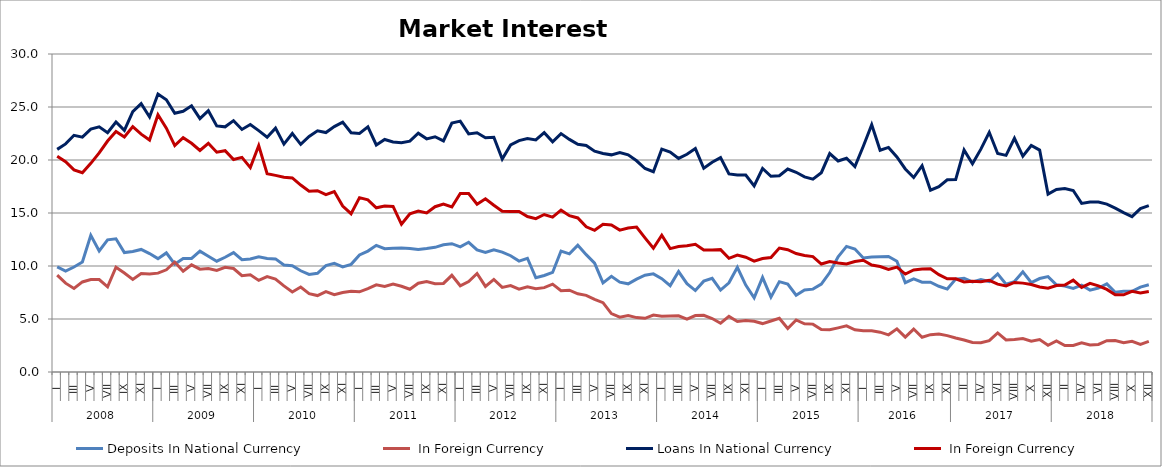
| Category | Deposits | Loans |
|---|---|---|
| 0 | 9.137 | 20.354 |
| 1 | 8.38 | 19.831 |
| 2 | 7.883 | 19.065 |
| 3 | 8.496 | 18.793 |
| 4 | 8.724 | 19.686 |
| 5 | 8.718 | 20.674 |
| 6 | 8.041 | 21.792 |
| 7 | 9.883 | 22.683 |
| 8 | 9.345 | 22.171 |
| 9 | 8.74 | 23.151 |
| 10 | 9.296 | 22.44 |
| 11 | 9.249 | 21.881 |
| 12 | 9.327 | 24.264 |
| 13 | 9.643 | 23.008 |
| 14 | 10.375 | 21.357 |
| 15 | 9.5 | 22.1 |
| 16 | 10.112 | 21.579 |
| 17 | 9.7 | 20.9 |
| 18 | 9.755 | 21.577 |
| 19 | 9.586 | 20.738 |
| 20 | 9.871 | 20.882 |
| 21 | 9.763 | 20.05 |
| 22 | 9.091 | 20.248 |
| 23 | 9.175 | 19.284 |
| 24 | 8.643 | 21.363 |
| 25 | 8.997 | 18.71 |
| 26 | 8.763 | 18.548 |
| 27 | 8.129 | 18.381 |
| 28 | 7.542 | 18.308 |
| 29 | 8.016 | 17.639 |
| 30 | 7.391 | 17.062 |
| 31 | 7.21 | 17.1 |
| 32 | 7.587 | 16.729 |
| 33 | 7.286 | 17.025 |
| 34 | 7.492 | 15.659 |
| 35 | 7.61 | 14.933 |
| 36 | 7.567 | 16.448 |
| 37 | 7.87 | 16.245 |
| 38 | 8.222 | 15.495 |
| 39 | 8.08 | 15.667 |
| 40 | 8.291 | 15.619 |
| 41 | 8.087 | 13.934 |
| 42 | 7.811 | 14.92 |
| 43 | 8.37 | 15.184 |
| 44 | 8.526 | 15.009 |
| 45 | 8.33 | 15.595 |
| 46 | 8.356 | 15.834 |
| 47 | 9.122 | 15.574 |
| 48 | 8.134 | 16.848 |
| 49 | 8.538 | 16.83 |
| 50 | 9.292 | 15.829 |
| 51 | 8.074 | 16.345 |
| 52 | 8.733 | 15.733 |
| 53 | 7.982 | 15.168 |
| 54 | 8.15 | 15.137 |
| 55 | 7.811 | 15.15 |
| 56 | 8.033 | 14.665 |
| 57 | 7.859 | 14.472 |
| 58 | 7.958 | 14.858 |
| 59 | 8.289 | 14.612 |
| 60 | 7.668 | 15.267 |
| 61 | 7.721 | 14.749 |
| 62 | 7.38 | 14.533 |
| 63 | 7.234 | 13.698 |
| 64 | 6.856 | 13.365 |
| 65 | 6.545 | 13.936 |
| 66 | 5.508 | 13.862 |
| 67 | 5.179 | 13.383 |
| 68 | 5.319 | 13.588 |
| 69 | 5.132 | 13.67 |
| 70 | 5.067 | 12.658 |
| 71 | 5.368 | 11.674 |
| 72 | 5.25 | 12.906 |
| 73 | 5.279 | 11.641 |
| 74 | 5.297 | 11.841 |
| 75 | 4.985 | 11.909 |
| 76 | 5.325 | 12.051 |
| 77 | 5.352 | 11.504 |
| 78 | 5.047 | 11.499 |
| 79 | 4.596 | 11.543 |
| 80 | 5.244 | 10.726 |
| 81 | 4.762 | 11.036 |
| 82 | 4.869 | 10.828 |
| 83 | 4.779 | 10.462 |
| 84 | 4.569 | 10.7 |
| 85 | 4.811 | 10.805 |
| 86 | 5.066 | 11.691 |
| 87 | 4.1 | 11.535 |
| 88 | 4.907 | 11.178 |
| 89 | 4.545 | 11 |
| 90 | 4.517 | 10.889 |
| 91 | 4 | 10.188 |
| 92 | 3.981 | 10.416 |
| 93 | 4.164 | 10.276 |
| 94 | 4.358 | 10.188 |
| 95 | 3.977 | 10.418 |
| 96 | 3.892 | 10.543 |
| 97 | 3.89 | 10.092 |
| 98 | 3.757 | 9.946 |
| 99 | 3.505 | 9.677 |
| 100 | 4.071 | 9.899 |
| 101 | 3.296 | 9.237 |
| 102 | 4.052 | 9.631 |
| 103 | 3.28 | 9.709 |
| 104 | 3.523 | 9.747 |
| 105 | 3.578 | 9.18 |
| 106 | 3.431 | 8.793 |
| 107 | 3.202 | 8.797 |
| 108 | 3.022 | 8.494 |
| 109 | 2.785 | 8.558 |
| 110 | 2.769 | 8.517 |
| 111 | 2.953 | 8.646 |
| 112 | 3.69 | 8.286 |
| 113 | 3.022 | 8.114 |
| 114 | 3.063 | 8.452 |
| 115 | 3.156 | 8.385 |
| 116 | 2.9 | 8.257 |
| 117 | 3.057 | 8.025 |
| 118 | 2.522 | 7.91 |
| 119 | 2.938 | 8.164 |
| 120 | 2.492 | 8.208 |
| 121 | 2.51 | 8.664 |
| 122 | 2.75 | 7.978 |
| 123 | 2.556 | 8.364 |
| 124 | 2.597 | 8.133 |
| 125 | 2.959 | 7.791 |
| 126 | 2.968 | 7.284 |
| 127 | 2.764 | 7.278 |
| 128 | 2.898 | 7.604 |
| 129 | 2.611 | 7.462 |
| 130 | 2.891 | 7.598 |